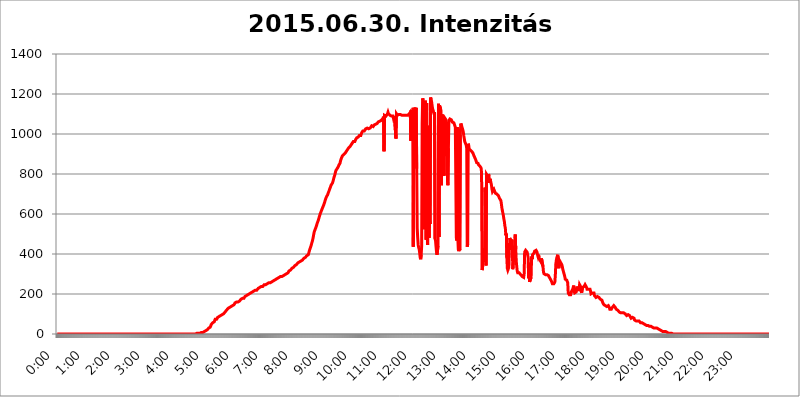
| Category | 2015.06.30. Intenzitás [W/m^2] |
|---|---|
| 0.0 | 0 |
| 0.0006944444444444445 | 0 |
| 0.001388888888888889 | 0 |
| 0.0020833333333333333 | 0 |
| 0.002777777777777778 | 0 |
| 0.003472222222222222 | 0 |
| 0.004166666666666667 | 0 |
| 0.004861111111111111 | 0 |
| 0.005555555555555556 | 0 |
| 0.0062499999999999995 | 0 |
| 0.006944444444444444 | 0 |
| 0.007638888888888889 | 0 |
| 0.008333333333333333 | 0 |
| 0.009027777777777779 | 0 |
| 0.009722222222222222 | 0 |
| 0.010416666666666666 | 0 |
| 0.011111111111111112 | 0 |
| 0.011805555555555555 | 0 |
| 0.012499999999999999 | 0 |
| 0.013194444444444444 | 0 |
| 0.013888888888888888 | 0 |
| 0.014583333333333332 | 0 |
| 0.015277777777777777 | 0 |
| 0.015972222222222224 | 0 |
| 0.016666666666666666 | 0 |
| 0.017361111111111112 | 0 |
| 0.018055555555555557 | 0 |
| 0.01875 | 0 |
| 0.019444444444444445 | 0 |
| 0.02013888888888889 | 0 |
| 0.020833333333333332 | 0 |
| 0.02152777777777778 | 0 |
| 0.022222222222222223 | 0 |
| 0.02291666666666667 | 0 |
| 0.02361111111111111 | 0 |
| 0.024305555555555556 | 0 |
| 0.024999999999999998 | 0 |
| 0.025694444444444447 | 0 |
| 0.02638888888888889 | 0 |
| 0.027083333333333334 | 0 |
| 0.027777777777777776 | 0 |
| 0.02847222222222222 | 0 |
| 0.029166666666666664 | 0 |
| 0.029861111111111113 | 0 |
| 0.030555555555555555 | 0 |
| 0.03125 | 0 |
| 0.03194444444444445 | 0 |
| 0.03263888888888889 | 0 |
| 0.03333333333333333 | 0 |
| 0.034027777777777775 | 0 |
| 0.034722222222222224 | 0 |
| 0.035416666666666666 | 0 |
| 0.036111111111111115 | 0 |
| 0.03680555555555556 | 0 |
| 0.0375 | 0 |
| 0.03819444444444444 | 0 |
| 0.03888888888888889 | 0 |
| 0.03958333333333333 | 0 |
| 0.04027777777777778 | 0 |
| 0.04097222222222222 | 0 |
| 0.041666666666666664 | 0 |
| 0.042361111111111106 | 0 |
| 0.04305555555555556 | 0 |
| 0.043750000000000004 | 0 |
| 0.044444444444444446 | 0 |
| 0.04513888888888889 | 0 |
| 0.04583333333333334 | 0 |
| 0.04652777777777778 | 0 |
| 0.04722222222222222 | 0 |
| 0.04791666666666666 | 0 |
| 0.04861111111111111 | 0 |
| 0.049305555555555554 | 0 |
| 0.049999999999999996 | 0 |
| 0.05069444444444445 | 0 |
| 0.051388888888888894 | 0 |
| 0.052083333333333336 | 0 |
| 0.05277777777777778 | 0 |
| 0.05347222222222222 | 0 |
| 0.05416666666666667 | 0 |
| 0.05486111111111111 | 0 |
| 0.05555555555555555 | 0 |
| 0.05625 | 0 |
| 0.05694444444444444 | 0 |
| 0.057638888888888885 | 0 |
| 0.05833333333333333 | 0 |
| 0.05902777777777778 | 0 |
| 0.059722222222222225 | 0 |
| 0.06041666666666667 | 0 |
| 0.061111111111111116 | 0 |
| 0.06180555555555556 | 0 |
| 0.0625 | 0 |
| 0.06319444444444444 | 0 |
| 0.06388888888888888 | 0 |
| 0.06458333333333334 | 0 |
| 0.06527777777777778 | 0 |
| 0.06597222222222222 | 0 |
| 0.06666666666666667 | 0 |
| 0.06736111111111111 | 0 |
| 0.06805555555555555 | 0 |
| 0.06874999999999999 | 0 |
| 0.06944444444444443 | 0 |
| 0.07013888888888889 | 0 |
| 0.07083333333333333 | 0 |
| 0.07152777777777779 | 0 |
| 0.07222222222222223 | 0 |
| 0.07291666666666667 | 0 |
| 0.07361111111111111 | 0 |
| 0.07430555555555556 | 0 |
| 0.075 | 0 |
| 0.07569444444444444 | 0 |
| 0.0763888888888889 | 0 |
| 0.07708333333333334 | 0 |
| 0.07777777777777778 | 0 |
| 0.07847222222222222 | 0 |
| 0.07916666666666666 | 0 |
| 0.0798611111111111 | 0 |
| 0.08055555555555556 | 0 |
| 0.08125 | 0 |
| 0.08194444444444444 | 0 |
| 0.08263888888888889 | 0 |
| 0.08333333333333333 | 0 |
| 0.08402777777777777 | 0 |
| 0.08472222222222221 | 0 |
| 0.08541666666666665 | 0 |
| 0.08611111111111112 | 0 |
| 0.08680555555555557 | 0 |
| 0.08750000000000001 | 0 |
| 0.08819444444444445 | 0 |
| 0.08888888888888889 | 0 |
| 0.08958333333333333 | 0 |
| 0.09027777777777778 | 0 |
| 0.09097222222222222 | 0 |
| 0.09166666666666667 | 0 |
| 0.09236111111111112 | 0 |
| 0.09305555555555556 | 0 |
| 0.09375 | 0 |
| 0.09444444444444444 | 0 |
| 0.09513888888888888 | 0 |
| 0.09583333333333333 | 0 |
| 0.09652777777777777 | 0 |
| 0.09722222222222222 | 0 |
| 0.09791666666666667 | 0 |
| 0.09861111111111111 | 0 |
| 0.09930555555555555 | 0 |
| 0.09999999999999999 | 0 |
| 0.10069444444444443 | 0 |
| 0.1013888888888889 | 0 |
| 0.10208333333333335 | 0 |
| 0.10277777777777779 | 0 |
| 0.10347222222222223 | 0 |
| 0.10416666666666667 | 0 |
| 0.10486111111111111 | 0 |
| 0.10555555555555556 | 0 |
| 0.10625 | 0 |
| 0.10694444444444444 | 0 |
| 0.1076388888888889 | 0 |
| 0.10833333333333334 | 0 |
| 0.10902777777777778 | 0 |
| 0.10972222222222222 | 0 |
| 0.1111111111111111 | 0 |
| 0.11180555555555556 | 0 |
| 0.11180555555555556 | 0 |
| 0.1125 | 0 |
| 0.11319444444444444 | 0 |
| 0.11388888888888889 | 0 |
| 0.11458333333333333 | 0 |
| 0.11527777777777777 | 0 |
| 0.11597222222222221 | 0 |
| 0.11666666666666665 | 0 |
| 0.1173611111111111 | 0 |
| 0.11805555555555557 | 0 |
| 0.11944444444444445 | 0 |
| 0.12013888888888889 | 0 |
| 0.12083333333333333 | 0 |
| 0.12152777777777778 | 0 |
| 0.12222222222222223 | 0 |
| 0.12291666666666667 | 0 |
| 0.12291666666666667 | 0 |
| 0.12361111111111112 | 0 |
| 0.12430555555555556 | 0 |
| 0.125 | 0 |
| 0.12569444444444444 | 0 |
| 0.12638888888888888 | 0 |
| 0.12708333333333333 | 0 |
| 0.16875 | 0 |
| 0.12847222222222224 | 0 |
| 0.12916666666666668 | 0 |
| 0.12986111111111112 | 0 |
| 0.13055555555555556 | 0 |
| 0.13125 | 0 |
| 0.13194444444444445 | 0 |
| 0.1326388888888889 | 0 |
| 0.13333333333333333 | 0 |
| 0.13402777777777777 | 0 |
| 0.13402777777777777 | 0 |
| 0.13472222222222222 | 0 |
| 0.13541666666666666 | 0 |
| 0.1361111111111111 | 0 |
| 0.13749999999999998 | 0 |
| 0.13819444444444443 | 0 |
| 0.1388888888888889 | 0 |
| 0.13958333333333334 | 0 |
| 0.14027777777777778 | 0 |
| 0.14097222222222222 | 0 |
| 0.14166666666666666 | 0 |
| 0.1423611111111111 | 0 |
| 0.14305555555555557 | 0 |
| 0.14375000000000002 | 0 |
| 0.14444444444444446 | 0 |
| 0.1451388888888889 | 0 |
| 0.1451388888888889 | 0 |
| 0.14652777777777778 | 0 |
| 0.14722222222222223 | 0 |
| 0.14791666666666667 | 0 |
| 0.1486111111111111 | 0 |
| 0.14930555555555555 | 0 |
| 0.15 | 0 |
| 0.15069444444444444 | 0 |
| 0.15138888888888888 | 0 |
| 0.15208333333333332 | 0 |
| 0.15277777777777776 | 0 |
| 0.15347222222222223 | 0 |
| 0.15416666666666667 | 0 |
| 0.15486111111111112 | 0 |
| 0.15555555555555556 | 0 |
| 0.15625 | 0 |
| 0.15694444444444444 | 0 |
| 0.15763888888888888 | 0 |
| 0.15833333333333333 | 0 |
| 0.15902777777777777 | 0 |
| 0.15972222222222224 | 0 |
| 0.16041666666666668 | 0 |
| 0.16111111111111112 | 0 |
| 0.16180555555555556 | 0 |
| 0.1625 | 0 |
| 0.16319444444444445 | 0 |
| 0.1638888888888889 | 0 |
| 0.16458333333333333 | 0 |
| 0.16527777777777777 | 0 |
| 0.16597222222222222 | 0 |
| 0.16666666666666666 | 0 |
| 0.1673611111111111 | 0 |
| 0.16805555555555554 | 0 |
| 0.16874999999999998 | 0 |
| 0.16944444444444443 | 0 |
| 0.17013888888888887 | 0 |
| 0.1708333333333333 | 0 |
| 0.17152777777777775 | 0 |
| 0.17222222222222225 | 0 |
| 0.1729166666666667 | 0 |
| 0.17361111111111113 | 0 |
| 0.17430555555555557 | 0 |
| 0.17500000000000002 | 0 |
| 0.17569444444444446 | 0 |
| 0.1763888888888889 | 0 |
| 0.17708333333333334 | 0 |
| 0.17777777777777778 | 0 |
| 0.17847222222222223 | 0 |
| 0.17916666666666667 | 0 |
| 0.1798611111111111 | 0 |
| 0.18055555555555555 | 0 |
| 0.18125 | 0 |
| 0.18194444444444444 | 0 |
| 0.1826388888888889 | 0 |
| 0.18333333333333335 | 0 |
| 0.1840277777777778 | 0 |
| 0.18472222222222223 | 0 |
| 0.18541666666666667 | 0 |
| 0.18611111111111112 | 0 |
| 0.18680555555555556 | 0 |
| 0.1875 | 0 |
| 0.18819444444444444 | 0 |
| 0.18888888888888888 | 0 |
| 0.18958333333333333 | 0 |
| 0.19027777777777777 | 0 |
| 0.1909722222222222 | 0 |
| 0.19166666666666665 | 0 |
| 0.19236111111111112 | 0 |
| 0.19305555555555554 | 0 |
| 0.19375 | 0 |
| 0.19444444444444445 | 3.525 |
| 0.1951388888888889 | 3.525 |
| 0.19583333333333333 | 3.525 |
| 0.19652777777777777 | 3.525 |
| 0.19722222222222222 | 3.525 |
| 0.19791666666666666 | 3.525 |
| 0.1986111111111111 | 3.525 |
| 0.19930555555555554 | 3.525 |
| 0.19999999999999998 | 3.525 |
| 0.20069444444444443 | 3.525 |
| 0.20138888888888887 | 7.887 |
| 0.2020833333333333 | 7.887 |
| 0.2027777777777778 | 7.887 |
| 0.2034722222222222 | 7.887 |
| 0.2041666666666667 | 7.887 |
| 0.20486111111111113 | 12.257 |
| 0.20555555555555557 | 12.257 |
| 0.20625000000000002 | 12.257 |
| 0.20694444444444446 | 12.257 |
| 0.2076388888888889 | 12.257 |
| 0.20833333333333334 | 16.636 |
| 0.20902777777777778 | 16.636 |
| 0.20972222222222223 | 16.636 |
| 0.21041666666666667 | 21.024 |
| 0.2111111111111111 | 21.024 |
| 0.21180555555555555 | 25.419 |
| 0.2125 | 29.823 |
| 0.21319444444444444 | 34.234 |
| 0.2138888888888889 | 34.234 |
| 0.21458333333333335 | 34.234 |
| 0.2152777777777778 | 38.653 |
| 0.21597222222222223 | 47.511 |
| 0.21666666666666667 | 47.511 |
| 0.21736111111111112 | 51.951 |
| 0.21805555555555556 | 56.398 |
| 0.21875 | 56.398 |
| 0.21944444444444444 | 56.398 |
| 0.22013888888888888 | 60.85 |
| 0.22083333333333333 | 65.31 |
| 0.22152777777777777 | 74.246 |
| 0.2222222222222222 | 74.246 |
| 0.22291666666666665 | 74.246 |
| 0.2236111111111111 | 74.246 |
| 0.22430555555555556 | 78.722 |
| 0.225 | 83.205 |
| 0.22569444444444445 | 83.205 |
| 0.2263888888888889 | 83.205 |
| 0.22708333333333333 | 87.692 |
| 0.22777777777777777 | 92.184 |
| 0.22847222222222222 | 92.184 |
| 0.22916666666666666 | 92.184 |
| 0.2298611111111111 | 92.184 |
| 0.23055555555555554 | 96.682 |
| 0.23124999999999998 | 96.682 |
| 0.23194444444444443 | 96.682 |
| 0.23263888888888887 | 101.184 |
| 0.2333333333333333 | 101.184 |
| 0.2340277777777778 | 105.69 |
| 0.2347222222222222 | 105.69 |
| 0.2354166666666667 | 110.201 |
| 0.23611111111111113 | 110.201 |
| 0.23680555555555557 | 114.716 |
| 0.23750000000000002 | 119.235 |
| 0.23819444444444446 | 119.235 |
| 0.2388888888888889 | 123.758 |
| 0.23958333333333334 | 128.284 |
| 0.24027777777777778 | 128.284 |
| 0.24097222222222223 | 128.284 |
| 0.24166666666666667 | 132.814 |
| 0.2423611111111111 | 132.814 |
| 0.24305555555555555 | 137.347 |
| 0.24375 | 137.347 |
| 0.24444444444444446 | 141.884 |
| 0.24513888888888888 | 141.884 |
| 0.24583333333333335 | 141.884 |
| 0.2465277777777778 | 141.884 |
| 0.24722222222222223 | 141.884 |
| 0.24791666666666667 | 146.423 |
| 0.24861111111111112 | 150.964 |
| 0.24930555555555556 | 155.509 |
| 0.25 | 155.509 |
| 0.25069444444444444 | 155.509 |
| 0.2513888888888889 | 160.056 |
| 0.2520833333333333 | 160.056 |
| 0.25277777777777777 | 160.056 |
| 0.2534722222222222 | 160.056 |
| 0.25416666666666665 | 160.056 |
| 0.2548611111111111 | 164.605 |
| 0.2555555555555556 | 164.605 |
| 0.25625000000000003 | 169.156 |
| 0.2569444444444445 | 169.156 |
| 0.2576388888888889 | 173.709 |
| 0.25833333333333336 | 173.709 |
| 0.2590277777777778 | 173.709 |
| 0.25972222222222224 | 178.264 |
| 0.2604166666666667 | 178.264 |
| 0.2611111111111111 | 178.264 |
| 0.26180555555555557 | 178.264 |
| 0.2625 | 182.82 |
| 0.26319444444444445 | 187.378 |
| 0.2638888888888889 | 191.937 |
| 0.26458333333333334 | 191.937 |
| 0.2652777777777778 | 191.937 |
| 0.2659722222222222 | 196.497 |
| 0.26666666666666666 | 196.497 |
| 0.2673611111111111 | 196.497 |
| 0.26805555555555555 | 196.497 |
| 0.26875 | 201.058 |
| 0.26944444444444443 | 201.058 |
| 0.2701388888888889 | 201.058 |
| 0.2708333333333333 | 205.62 |
| 0.27152777777777776 | 205.62 |
| 0.2722222222222222 | 205.62 |
| 0.27291666666666664 | 205.62 |
| 0.2736111111111111 | 210.182 |
| 0.2743055555555555 | 210.182 |
| 0.27499999999999997 | 214.746 |
| 0.27569444444444446 | 214.746 |
| 0.27638888888888885 | 214.746 |
| 0.27708333333333335 | 219.309 |
| 0.2777777777777778 | 219.309 |
| 0.27847222222222223 | 219.309 |
| 0.2791666666666667 | 219.309 |
| 0.2798611111111111 | 219.309 |
| 0.28055555555555556 | 223.873 |
| 0.28125 | 223.873 |
| 0.28194444444444444 | 228.436 |
| 0.2826388888888889 | 228.436 |
| 0.2833333333333333 | 228.436 |
| 0.28402777777777777 | 233 |
| 0.2847222222222222 | 233 |
| 0.28541666666666665 | 233 |
| 0.28611111111111115 | 237.564 |
| 0.28680555555555554 | 237.564 |
| 0.28750000000000003 | 237.564 |
| 0.2881944444444445 | 237.564 |
| 0.2888888888888889 | 242.127 |
| 0.28958333333333336 | 242.127 |
| 0.2902777777777778 | 246.689 |
| 0.29097222222222224 | 246.689 |
| 0.2916666666666667 | 246.689 |
| 0.2923611111111111 | 246.689 |
| 0.29305555555555557 | 246.689 |
| 0.29375 | 251.251 |
| 0.29444444444444445 | 251.251 |
| 0.2951388888888889 | 251.251 |
| 0.29583333333333334 | 251.251 |
| 0.2965277777777778 | 255.813 |
| 0.2972222222222222 | 255.813 |
| 0.29791666666666666 | 255.813 |
| 0.2986111111111111 | 255.813 |
| 0.29930555555555555 | 260.373 |
| 0.3 | 260.373 |
| 0.30069444444444443 | 260.373 |
| 0.3013888888888889 | 264.932 |
| 0.3020833333333333 | 264.932 |
| 0.30277777777777776 | 264.932 |
| 0.3034722222222222 | 269.49 |
| 0.30416666666666664 | 269.49 |
| 0.3048611111111111 | 269.49 |
| 0.3055555555555555 | 269.49 |
| 0.30624999999999997 | 274.047 |
| 0.3069444444444444 | 274.047 |
| 0.3076388888888889 | 274.047 |
| 0.30833333333333335 | 278.603 |
| 0.3090277777777778 | 278.603 |
| 0.30972222222222223 | 278.603 |
| 0.3104166666666667 | 283.156 |
| 0.3111111111111111 | 283.156 |
| 0.31180555555555556 | 283.156 |
| 0.3125 | 283.156 |
| 0.31319444444444444 | 287.709 |
| 0.3138888888888889 | 287.709 |
| 0.3145833333333333 | 287.709 |
| 0.31527777777777777 | 287.709 |
| 0.3159722222222222 | 287.709 |
| 0.31666666666666665 | 292.259 |
| 0.31736111111111115 | 292.259 |
| 0.31805555555555554 | 292.259 |
| 0.31875000000000003 | 292.259 |
| 0.3194444444444445 | 296.808 |
| 0.3201388888888889 | 296.808 |
| 0.32083333333333336 | 296.808 |
| 0.3215277777777778 | 301.354 |
| 0.32222222222222224 | 305.898 |
| 0.3229166666666667 | 305.898 |
| 0.3236111111111111 | 305.898 |
| 0.32430555555555557 | 310.44 |
| 0.325 | 314.98 |
| 0.32569444444444445 | 314.98 |
| 0.3263888888888889 | 319.517 |
| 0.32708333333333334 | 319.517 |
| 0.3277777777777778 | 324.052 |
| 0.3284722222222222 | 324.052 |
| 0.32916666666666666 | 328.584 |
| 0.3298611111111111 | 328.584 |
| 0.33055555555555555 | 333.113 |
| 0.33125 | 333.113 |
| 0.33194444444444443 | 333.113 |
| 0.3326388888888889 | 337.639 |
| 0.3333333333333333 | 342.162 |
| 0.3340277777777778 | 342.162 |
| 0.3347222222222222 | 342.162 |
| 0.3354166666666667 | 346.682 |
| 0.3361111111111111 | 351.198 |
| 0.3368055555555556 | 351.198 |
| 0.33749999999999997 | 355.712 |
| 0.33819444444444446 | 355.712 |
| 0.33888888888888885 | 355.712 |
| 0.33958333333333335 | 360.221 |
| 0.34027777777777773 | 360.221 |
| 0.34097222222222223 | 364.728 |
| 0.3416666666666666 | 364.728 |
| 0.3423611111111111 | 364.728 |
| 0.3430555555555555 | 369.23 |
| 0.34375 | 369.23 |
| 0.3444444444444445 | 373.729 |
| 0.3451388888888889 | 373.729 |
| 0.3458333333333334 | 378.224 |
| 0.34652777777777777 | 378.224 |
| 0.34722222222222227 | 382.715 |
| 0.34791666666666665 | 382.715 |
| 0.34861111111111115 | 387.202 |
| 0.34930555555555554 | 387.202 |
| 0.35000000000000003 | 391.685 |
| 0.3506944444444444 | 391.685 |
| 0.3513888888888889 | 396.164 |
| 0.3520833333333333 | 396.164 |
| 0.3527777777777778 | 405.108 |
| 0.3534722222222222 | 409.574 |
| 0.3541666666666667 | 422.943 |
| 0.3548611111111111 | 427.39 |
| 0.35555555555555557 | 436.27 |
| 0.35625 | 445.129 |
| 0.35694444444444445 | 453.968 |
| 0.3576388888888889 | 462.786 |
| 0.35833333333333334 | 471.582 |
| 0.3590277777777778 | 484.735 |
| 0.3597222222222222 | 497.836 |
| 0.36041666666666666 | 510.885 |
| 0.3611111111111111 | 515.223 |
| 0.36180555555555555 | 523.88 |
| 0.3625 | 528.2 |
| 0.36319444444444443 | 536.82 |
| 0.3638888888888889 | 545.416 |
| 0.3645833333333333 | 553.986 |
| 0.3652777777777778 | 558.261 |
| 0.3659722222222222 | 566.793 |
| 0.3666666666666667 | 575.299 |
| 0.3673611111111111 | 583.779 |
| 0.3680555555555556 | 592.233 |
| 0.36874999999999997 | 600.661 |
| 0.36944444444444446 | 604.864 |
| 0.37013888888888885 | 613.252 |
| 0.37083333333333335 | 617.436 |
| 0.37152777777777773 | 625.784 |
| 0.37222222222222223 | 629.948 |
| 0.3729166666666666 | 638.256 |
| 0.3736111111111111 | 642.4 |
| 0.3743055555555555 | 650.667 |
| 0.375 | 658.909 |
| 0.3756944444444445 | 667.123 |
| 0.3763888888888889 | 675.311 |
| 0.3770833333333334 | 679.395 |
| 0.37777777777777777 | 687.544 |
| 0.37847222222222227 | 691.608 |
| 0.37916666666666665 | 695.666 |
| 0.37986111111111115 | 703.762 |
| 0.38055555555555554 | 707.8 |
| 0.38125000000000003 | 715.858 |
| 0.3819444444444444 | 723.889 |
| 0.3826388888888889 | 727.896 |
| 0.3833333333333333 | 735.89 |
| 0.3840277777777778 | 743.859 |
| 0.3847222222222222 | 743.859 |
| 0.3854166666666667 | 743.859 |
| 0.3861111111111111 | 755.766 |
| 0.38680555555555557 | 763.674 |
| 0.3875 | 767.62 |
| 0.38819444444444445 | 783.342 |
| 0.3888888888888889 | 787.258 |
| 0.38958333333333334 | 798.974 |
| 0.3902777777777778 | 810.641 |
| 0.3909722222222222 | 818.392 |
| 0.39166666666666666 | 822.26 |
| 0.3923611111111111 | 826.123 |
| 0.39305555555555555 | 829.981 |
| 0.39375 | 833.834 |
| 0.39444444444444443 | 837.682 |
| 0.3951388888888889 | 845.365 |
| 0.3958333333333333 | 849.199 |
| 0.3965277777777778 | 853.029 |
| 0.3972222222222222 | 864.493 |
| 0.3979166666666667 | 872.114 |
| 0.3986111111111111 | 879.719 |
| 0.3993055555555556 | 883.516 |
| 0.39999999999999997 | 891.099 |
| 0.40069444444444446 | 894.885 |
| 0.40138888888888885 | 894.885 |
| 0.40208333333333335 | 898.668 |
| 0.40277777777777773 | 902.447 |
| 0.40347222222222223 | 902.447 |
| 0.4041666666666666 | 906.223 |
| 0.4048611111111111 | 909.996 |
| 0.4055555555555555 | 913.766 |
| 0.40625 | 913.766 |
| 0.4069444444444445 | 921.298 |
| 0.4076388888888889 | 925.06 |
| 0.4083333333333334 | 928.819 |
| 0.40902777777777777 | 928.819 |
| 0.40972222222222227 | 932.576 |
| 0.41041666666666665 | 936.33 |
| 0.41111111111111115 | 936.33 |
| 0.41180555555555554 | 940.082 |
| 0.41250000000000003 | 947.58 |
| 0.4131944444444444 | 947.58 |
| 0.4138888888888889 | 955.071 |
| 0.4145833333333333 | 955.071 |
| 0.4152777777777778 | 962.555 |
| 0.4159722222222222 | 962.555 |
| 0.4166666666666667 | 962.555 |
| 0.4173611111111111 | 962.555 |
| 0.41805555555555557 | 966.295 |
| 0.41875 | 973.772 |
| 0.41944444444444445 | 977.508 |
| 0.4201388888888889 | 981.244 |
| 0.42083333333333334 | 981.244 |
| 0.4215277777777778 | 984.98 |
| 0.4222222222222222 | 984.98 |
| 0.42291666666666666 | 988.714 |
| 0.4236111111111111 | 992.448 |
| 0.42430555555555555 | 992.448 |
| 0.425 | 992.448 |
| 0.42569444444444443 | 992.448 |
| 0.4263888888888889 | 999.916 |
| 0.4270833333333333 | 1007.383 |
| 0.4277777777777778 | 1007.383 |
| 0.4284722222222222 | 1014.852 |
| 0.4291666666666667 | 1014.852 |
| 0.4298611111111111 | 1014.852 |
| 0.4305555555555556 | 1014.852 |
| 0.43124999999999997 | 1014.852 |
| 0.43194444444444446 | 1014.852 |
| 0.43263888888888885 | 1026.06 |
| 0.43333333333333335 | 1022.323 |
| 0.43402777777777773 | 1029.798 |
| 0.43472222222222223 | 1029.798 |
| 0.4354166666666666 | 1029.798 |
| 0.4361111111111111 | 1026.06 |
| 0.4368055555555555 | 1026.06 |
| 0.4375 | 1029.798 |
| 0.4381944444444445 | 1029.798 |
| 0.4388888888888889 | 1029.798 |
| 0.4395833333333334 | 1033.537 |
| 0.44027777777777777 | 1033.537 |
| 0.44097222222222227 | 1041.019 |
| 0.44166666666666665 | 1041.019 |
| 0.44236111111111115 | 1041.019 |
| 0.44305555555555554 | 1037.277 |
| 0.44375000000000003 | 1041.019 |
| 0.4444444444444444 | 1044.762 |
| 0.4451388888888889 | 1041.019 |
| 0.4458333333333333 | 1044.762 |
| 0.4465277777777778 | 1048.508 |
| 0.4472222222222222 | 1044.762 |
| 0.4479166666666667 | 1048.508 |
| 0.4486111111111111 | 1052.255 |
| 0.44930555555555557 | 1056.004 |
| 0.45 | 1059.756 |
| 0.45069444444444445 | 1056.004 |
| 0.4513888888888889 | 1063.51 |
| 0.45208333333333334 | 1063.51 |
| 0.4527777777777778 | 1059.756 |
| 0.4534722222222222 | 1067.267 |
| 0.45416666666666666 | 1067.267 |
| 0.4548611111111111 | 1067.267 |
| 0.45555555555555555 | 1071.027 |
| 0.45625 | 1074.789 |
| 0.45694444444444443 | 1074.789 |
| 0.4576388888888889 | 1086.097 |
| 0.4583333333333333 | 913.766 |
| 0.4590277777777778 | 1093.653 |
| 0.4597222222222222 | 1089.873 |
| 0.4604166666666667 | 1089.873 |
| 0.4611111111111111 | 1089.873 |
| 0.4618055555555556 | 1093.653 |
| 0.46249999999999997 | 1093.653 |
| 0.46319444444444446 | 1101.226 |
| 0.46388888888888885 | 1108.816 |
| 0.46458333333333335 | 1101.226 |
| 0.46527777777777773 | 1101.226 |
| 0.46597222222222223 | 1097.437 |
| 0.4666666666666666 | 1093.653 |
| 0.4673611111111111 | 1093.653 |
| 0.4680555555555555 | 1089.873 |
| 0.46875 | 1089.873 |
| 0.4694444444444445 | 1089.873 |
| 0.4701388888888889 | 1086.097 |
| 0.4708333333333334 | 1089.873 |
| 0.47152777777777777 | 1078.555 |
| 0.47222222222222227 | 1078.555 |
| 0.47291666666666665 | 1089.873 |
| 0.47361111111111115 | 1086.097 |
| 0.47430555555555554 | 1086.097 |
| 0.47500000000000003 | 977.508 |
| 0.4756944444444444 | 1101.226 |
| 0.4763888888888889 | 1097.437 |
| 0.4770833333333333 | 1093.653 |
| 0.4777777777777778 | 1089.873 |
| 0.4784722222222222 | 1093.653 |
| 0.4791666666666667 | 1097.437 |
| 0.4798611111111111 | 1097.437 |
| 0.48055555555555557 | 1097.437 |
| 0.48125 | 1097.437 |
| 0.48194444444444445 | 1097.437 |
| 0.4826388888888889 | 1097.437 |
| 0.48333333333333334 | 1093.653 |
| 0.4840277777777778 | 1097.437 |
| 0.4847222222222222 | 1097.437 |
| 0.48541666666666666 | 1093.653 |
| 0.4861111111111111 | 1097.437 |
| 0.48680555555555555 | 1093.653 |
| 0.4875 | 1093.653 |
| 0.48819444444444443 | 1093.653 |
| 0.4888888888888889 | 1089.873 |
| 0.4895833333333333 | 1093.653 |
| 0.4902777777777778 | 1097.437 |
| 0.4909722222222222 | 1097.437 |
| 0.4916666666666667 | 1093.653 |
| 0.4923611111111111 | 1089.873 |
| 0.4930555555555556 | 1093.653 |
| 0.49374999999999997 | 1101.226 |
| 0.49444444444444446 | 1105.019 |
| 0.49513888888888885 | 1108.816 |
| 0.49583333333333335 | 966.295 |
| 0.49652777777777773 | 1120.238 |
| 0.49722222222222223 | 1108.816 |
| 0.4979166666666666 | 1108.816 |
| 0.4986111111111111 | 1059.756 |
| 0.4993055555555555 | 436.27 |
| 0.5 | 1131.708 |
| 0.5006944444444444 | 1127.879 |
| 0.5013888888888889 | 1101.226 |
| 0.5020833333333333 | 1105.019 |
| 0.5027777777777778 | 1101.226 |
| 0.5034722222222222 | 1131.708 |
| 0.5041666666666667 | 826.123 |
| 0.5048611111111111 | 528.2 |
| 0.5055555555555555 | 480.356 |
| 0.50625 | 445.129 |
| 0.5069444444444444 | 431.833 |
| 0.5076388888888889 | 422.943 |
| 0.5083333333333333 | 405.108 |
| 0.5090277777777777 | 382.715 |
| 0.5097222222222222 | 373.729 |
| 0.5104166666666666 | 396.164 |
| 0.5111111111111112 | 440.702 |
| 0.5118055555555555 | 1052.255 |
| 0.5125000000000001 | 1178.177 |
| 0.5131944444444444 | 1170.358 |
| 0.513888888888889 | 1166.46 |
| 0.5145833333333333 | 906.223 |
| 0.5152777777777778 | 523.88 |
| 0.5159722222222222 | 1166.46 |
| 0.5166666666666667 | 1150.946 |
| 0.517361111111111 | 471.582 |
| 0.5180555555555556 | 1154.814 |
| 0.5187499999999999 | 510.885 |
| 0.5194444444444445 | 445.129 |
| 0.5201388888888888 | 1041.019 |
| 0.5208333333333334 | 860.676 |
| 0.5215277777777778 | 480.356 |
| 0.5222222222222223 | 566.793 |
| 0.5229166666666667 | 549.704 |
| 0.5236111111111111 | 1182.099 |
| 0.5243055555555556 | 1174.263 |
| 0.525 | 1162.571 |
| 0.5256944444444445 | 1143.232 |
| 0.5263888888888889 | 1127.879 |
| 0.5270833333333333 | 1120.238 |
| 0.5277777777777778 | 1108.816 |
| 0.5284722222222222 | 1101.226 |
| 0.5291666666666667 | 1108.816 |
| 0.5298611111111111 | 475.972 |
| 0.5305555555555556 | 467.187 |
| 0.53125 | 436.27 |
| 0.5319444444444444 | 409.574 |
| 0.5326388888888889 | 396.164 |
| 0.5333333333333333 | 396.164 |
| 0.5340277777777778 | 440.702 |
| 0.5347222222222222 | 1150.946 |
| 0.5354166666666667 | 484.735 |
| 0.5361111111111111 | 1143.232 |
| 0.5368055555555555 | 1139.384 |
| 0.5375 | 1127.879 |
| 0.5381944444444444 | 1116.426 |
| 0.5388888888888889 | 743.859 |
| 0.5395833333333333 | 1097.437 |
| 0.5402777777777777 | 1089.873 |
| 0.5409722222222222 | 1086.097 |
| 0.5416666666666666 | 1082.324 |
| 0.5423611111111112 | 791.169 |
| 0.5430555555555555 | 1063.51 |
| 0.5437500000000001 | 1078.555 |
| 0.5444444444444444 | 1074.789 |
| 0.545138888888889 | 1071.027 |
| 0.5458333333333333 | 1059.756 |
| 0.5465277777777778 | 1048.508 |
| 0.5472222222222222 | 771.559 |
| 0.5479166666666667 | 743.859 |
| 0.548611111111111 | 928.819 |
| 0.5493055555555556 | 1067.267 |
| 0.5499999999999999 | 1071.027 |
| 0.5506944444444445 | 1074.789 |
| 0.5513888888888888 | 1074.789 |
| 0.5520833333333334 | 1074.789 |
| 0.5527777777777778 | 1071.027 |
| 0.5534722222222223 | 1067.267 |
| 0.5541666666666667 | 1059.756 |
| 0.5548611111111111 | 1059.756 |
| 0.5555555555555556 | 1056.004 |
| 0.55625 | 1056.004 |
| 0.5569444444444445 | 1052.255 |
| 0.5576388888888889 | 1041.019 |
| 0.5583333333333333 | 1033.537 |
| 0.5590277777777778 | 1033.537 |
| 0.5597222222222222 | 480.356 |
| 0.5604166666666667 | 467.187 |
| 0.5611111111111111 | 1033.537 |
| 0.5618055555555556 | 480.356 |
| 0.5625 | 422.943 |
| 0.5631944444444444 | 414.035 |
| 0.5638888888888889 | 427.39 |
| 0.5645833333333333 | 418.492 |
| 0.5652777777777778 | 996.182 |
| 0.5659722222222222 | 1052.255 |
| 0.5666666666666667 | 1048.508 |
| 0.5673611111111111 | 1037.277 |
| 0.5680555555555555 | 1037.277 |
| 0.56875 | 1022.323 |
| 0.5694444444444444 | 1011.118 |
| 0.5701388888888889 | 992.448 |
| 0.5708333333333333 | 992.448 |
| 0.5715277777777777 | 962.555 |
| 0.5722222222222222 | 958.814 |
| 0.5729166666666666 | 962.555 |
| 0.5736111111111112 | 943.832 |
| 0.5743055555555555 | 928.819 |
| 0.5750000000000001 | 436.27 |
| 0.5756944444444444 | 449.551 |
| 0.576388888888889 | 951.327 |
| 0.5770833333333333 | 943.832 |
| 0.5777777777777778 | 925.06 |
| 0.5784722222222222 | 928.819 |
| 0.5791666666666667 | 925.06 |
| 0.579861111111111 | 917.534 |
| 0.5805555555555556 | 917.534 |
| 0.5812499999999999 | 913.766 |
| 0.5819444444444445 | 909.996 |
| 0.5826388888888888 | 909.996 |
| 0.5833333333333334 | 902.447 |
| 0.5840277777777778 | 894.885 |
| 0.5847222222222223 | 891.099 |
| 0.5854166666666667 | 883.516 |
| 0.5861111111111111 | 883.516 |
| 0.5868055555555556 | 872.114 |
| 0.5875 | 864.493 |
| 0.5881944444444445 | 856.855 |
| 0.5888888888888889 | 856.855 |
| 0.5895833333333333 | 853.029 |
| 0.5902777777777778 | 853.029 |
| 0.5909722222222222 | 845.365 |
| 0.5916666666666667 | 845.365 |
| 0.5923611111111111 | 841.526 |
| 0.5930555555555556 | 837.682 |
| 0.59375 | 833.834 |
| 0.5944444444444444 | 829.981 |
| 0.5951388888888889 | 806.757 |
| 0.5958333333333333 | 319.517 |
| 0.5965277777777778 | 328.584 |
| 0.5972222222222222 | 382.715 |
| 0.5979166666666667 | 427.39 |
| 0.5986111111111111 | 360.221 |
| 0.5993055555555555 | 373.729 |
| 0.6 | 731.896 |
| 0.6006944444444444 | 596.45 |
| 0.6013888888888889 | 342.162 |
| 0.6020833333333333 | 798.974 |
| 0.6027777777777777 | 795.074 |
| 0.6034722222222222 | 791.169 |
| 0.6041666666666666 | 783.342 |
| 0.6048611111111112 | 798.974 |
| 0.6055555555555555 | 791.169 |
| 0.6062500000000001 | 755.766 |
| 0.6069444444444444 | 775.492 |
| 0.607638888888889 | 767.62 |
| 0.6083333333333333 | 755.766 |
| 0.6090277777777778 | 743.859 |
| 0.6097222222222222 | 723.889 |
| 0.6104166666666667 | 711.832 |
| 0.611111111111111 | 707.8 |
| 0.6118055555555556 | 719.877 |
| 0.6124999999999999 | 707.8 |
| 0.6131944444444445 | 715.858 |
| 0.6138888888888888 | 711.832 |
| 0.6145833333333334 | 703.762 |
| 0.6152777777777778 | 703.762 |
| 0.6159722222222223 | 699.717 |
| 0.6166666666666667 | 699.717 |
| 0.6173611111111111 | 695.666 |
| 0.6180555555555556 | 695.666 |
| 0.61875 | 691.608 |
| 0.6194444444444445 | 687.544 |
| 0.6201388888888889 | 679.395 |
| 0.6208333333333333 | 675.311 |
| 0.6215277777777778 | 675.311 |
| 0.6222222222222222 | 667.123 |
| 0.6229166666666667 | 650.667 |
| 0.6236111111111111 | 629.948 |
| 0.6243055555555556 | 617.436 |
| 0.625 | 604.864 |
| 0.6256944444444444 | 592.233 |
| 0.6263888888888889 | 575.299 |
| 0.6270833333333333 | 562.53 |
| 0.6277777777777778 | 541.121 |
| 0.6284722222222222 | 528.2 |
| 0.6291666666666667 | 493.475 |
| 0.6298611111111111 | 502.192 |
| 0.6305555555555555 | 382.715 |
| 0.63125 | 328.584 |
| 0.6319444444444444 | 319.517 |
| 0.6326388888888889 | 324.052 |
| 0.6333333333333333 | 333.113 |
| 0.6340277777777777 | 409.574 |
| 0.6347222222222222 | 480.356 |
| 0.6354166666666666 | 484.735 |
| 0.6361111111111112 | 484.735 |
| 0.6368055555555555 | 458.38 |
| 0.6375000000000001 | 471.582 |
| 0.6381944444444444 | 462.786 |
| 0.638888888888889 | 324.052 |
| 0.6395833333333333 | 355.712 |
| 0.6402777777777778 | 364.728 |
| 0.6409722222222222 | 360.221 |
| 0.6416666666666667 | 369.23 |
| 0.642361111111111 | 497.836 |
| 0.6430555555555556 | 422.943 |
| 0.6437499999999999 | 364.728 |
| 0.6444444444444445 | 337.639 |
| 0.6451388888888888 | 314.98 |
| 0.6458333333333334 | 305.898 |
| 0.6465277777777778 | 305.898 |
| 0.6472222222222223 | 305.898 |
| 0.6479166666666667 | 305.898 |
| 0.6486111111111111 | 305.898 |
| 0.6493055555555556 | 301.354 |
| 0.65 | 296.808 |
| 0.6506944444444445 | 296.808 |
| 0.6513888888888889 | 292.259 |
| 0.6520833333333333 | 287.709 |
| 0.6527777777777778 | 283.156 |
| 0.6534722222222222 | 283.156 |
| 0.6541666666666667 | 283.156 |
| 0.6548611111111111 | 301.354 |
| 0.6555555555555556 | 409.574 |
| 0.65625 | 414.035 |
| 0.6569444444444444 | 418.492 |
| 0.6576388888888889 | 418.492 |
| 0.6583333333333333 | 418.492 |
| 0.6590277777777778 | 409.574 |
| 0.6597222222222222 | 414.035 |
| 0.6604166666666667 | 382.715 |
| 0.6611111111111111 | 278.603 |
| 0.6618055555555555 | 355.712 |
| 0.6625 | 260.373 |
| 0.6631944444444444 | 260.373 |
| 0.6638888888888889 | 260.373 |
| 0.6645833333333333 | 283.156 |
| 0.6652777777777777 | 387.202 |
| 0.6659722222222222 | 373.729 |
| 0.6666666666666666 | 396.164 |
| 0.6673611111111111 | 391.685 |
| 0.6680555555555556 | 400.638 |
| 0.6687500000000001 | 405.108 |
| 0.6694444444444444 | 414.035 |
| 0.6701388888888888 | 418.492 |
| 0.6708333333333334 | 418.492 |
| 0.6715277777777778 | 418.492 |
| 0.6722222222222222 | 414.035 |
| 0.6729166666666666 | 409.574 |
| 0.6736111111111112 | 396.164 |
| 0.6743055555555556 | 387.202 |
| 0.6749999999999999 | 396.164 |
| 0.6756944444444444 | 382.715 |
| 0.6763888888888889 | 373.729 |
| 0.6770833333333334 | 373.729 |
| 0.6777777777777777 | 378.224 |
| 0.6784722222222223 | 360.221 |
| 0.6791666666666667 | 378.224 |
| 0.6798611111111111 | 378.224 |
| 0.6805555555555555 | 382.715 |
| 0.68125 | 337.639 |
| 0.6819444444444445 | 310.44 |
| 0.6826388888888889 | 301.354 |
| 0.6833333333333332 | 301.354 |
| 0.6840277777777778 | 296.808 |
| 0.6847222222222222 | 296.808 |
| 0.6854166666666667 | 296.808 |
| 0.686111111111111 | 296.808 |
| 0.6868055555555556 | 296.808 |
| 0.6875 | 292.259 |
| 0.6881944444444444 | 292.259 |
| 0.688888888888889 | 292.259 |
| 0.6895833333333333 | 292.259 |
| 0.6902777777777778 | 283.156 |
| 0.6909722222222222 | 278.603 |
| 0.6916666666666668 | 274.047 |
| 0.6923611111111111 | 269.49 |
| 0.6930555555555555 | 264.932 |
| 0.69375 | 260.373 |
| 0.6944444444444445 | 251.251 |
| 0.6951388888888889 | 246.689 |
| 0.6958333333333333 | 246.689 |
| 0.6965277777777777 | 251.251 |
| 0.6972222222222223 | 255.813 |
| 0.6979166666666666 | 260.373 |
| 0.6986111111111111 | 296.808 |
| 0.6993055555555556 | 351.198 |
| 0.7000000000000001 | 369.23 |
| 0.7006944444444444 | 382.715 |
| 0.7013888888888888 | 387.202 |
| 0.7020833333333334 | 396.164 |
| 0.7027777777777778 | 337.639 |
| 0.7034722222222222 | 328.584 |
| 0.7041666666666666 | 351.198 |
| 0.7048611111111112 | 364.728 |
| 0.7055555555555556 | 364.728 |
| 0.7062499999999999 | 355.712 |
| 0.7069444444444444 | 351.198 |
| 0.7076388888888889 | 346.682 |
| 0.7083333333333334 | 337.639 |
| 0.7090277777777777 | 324.052 |
| 0.7097222222222223 | 314.98 |
| 0.7104166666666667 | 305.898 |
| 0.7111111111111111 | 296.808 |
| 0.7118055555555555 | 287.709 |
| 0.7125 | 274.047 |
| 0.7131944444444445 | 269.49 |
| 0.7138888888888889 | 269.49 |
| 0.7145833333333332 | 269.49 |
| 0.7152777777777778 | 269.49 |
| 0.7159722222222222 | 255.813 |
| 0.7166666666666667 | 205.62 |
| 0.717361111111111 | 201.058 |
| 0.7180555555555556 | 196.497 |
| 0.71875 | 196.497 |
| 0.7194444444444444 | 191.937 |
| 0.720138888888889 | 196.497 |
| 0.7208333333333333 | 205.62 |
| 0.7215277777777778 | 214.746 |
| 0.7222222222222222 | 219.309 |
| 0.7229166666666668 | 223.873 |
| 0.7236111111111111 | 228.436 |
| 0.7243055555555555 | 242.127 |
| 0.725 | 214.746 |
| 0.7256944444444445 | 205.62 |
| 0.7263888888888889 | 201.058 |
| 0.7270833333333333 | 201.058 |
| 0.7277777777777777 | 210.182 |
| 0.7284722222222223 | 219.309 |
| 0.7291666666666666 | 237.564 |
| 0.7298611111111111 | 233 |
| 0.7305555555555556 | 214.746 |
| 0.7312500000000001 | 228.436 |
| 0.7319444444444444 | 219.309 |
| 0.7326388888888888 | 246.689 |
| 0.7333333333333334 | 242.127 |
| 0.7340277777777778 | 237.564 |
| 0.7347222222222222 | 214.746 |
| 0.7354166666666666 | 205.62 |
| 0.7361111111111112 | 205.62 |
| 0.7368055555555556 | 233 |
| 0.7374999999999999 | 237.564 |
| 0.7381944444444444 | 233 |
| 0.7388888888888889 | 237.564 |
| 0.7395833333333334 | 242.127 |
| 0.7402777777777777 | 246.689 |
| 0.7409722222222223 | 246.689 |
| 0.7416666666666667 | 242.127 |
| 0.7423611111111111 | 233 |
| 0.7430555555555555 | 223.873 |
| 0.74375 | 223.873 |
| 0.7444444444444445 | 223.873 |
| 0.7451388888888889 | 223.873 |
| 0.7458333333333332 | 228.436 |
| 0.7465277777777778 | 228.436 |
| 0.7472222222222222 | 223.873 |
| 0.7479166666666667 | 214.746 |
| 0.748611111111111 | 201.058 |
| 0.7493055555555556 | 201.058 |
| 0.75 | 196.497 |
| 0.7506944444444444 | 205.62 |
| 0.751388888888889 | 210.182 |
| 0.7520833333333333 | 210.182 |
| 0.7527777777777778 | 205.62 |
| 0.7534722222222222 | 191.937 |
| 0.7541666666666668 | 191.937 |
| 0.7548611111111111 | 187.378 |
| 0.7555555555555555 | 182.82 |
| 0.75625 | 182.82 |
| 0.7569444444444445 | 187.378 |
| 0.7576388888888889 | 187.378 |
| 0.7583333333333333 | 187.378 |
| 0.7590277777777777 | 187.378 |
| 0.7597222222222223 | 182.82 |
| 0.7604166666666666 | 178.264 |
| 0.7611111111111111 | 178.264 |
| 0.7618055555555556 | 173.709 |
| 0.7625000000000001 | 173.709 |
| 0.7631944444444444 | 173.709 |
| 0.7638888888888888 | 169.156 |
| 0.7645833333333334 | 164.605 |
| 0.7652777777777778 | 155.509 |
| 0.7659722222222222 | 155.509 |
| 0.7666666666666666 | 146.423 |
| 0.7673611111111112 | 146.423 |
| 0.7680555555555556 | 146.423 |
| 0.7687499999999999 | 141.884 |
| 0.7694444444444444 | 141.884 |
| 0.7701388888888889 | 137.347 |
| 0.7708333333333334 | 137.347 |
| 0.7715277777777777 | 141.884 |
| 0.7722222222222223 | 137.347 |
| 0.7729166666666667 | 141.884 |
| 0.7736111111111111 | 137.347 |
| 0.7743055555555555 | 132.814 |
| 0.775 | 123.758 |
| 0.7756944444444445 | 128.284 |
| 0.7763888888888889 | 119.235 |
| 0.7770833333333332 | 123.758 |
| 0.7777777777777778 | 128.284 |
| 0.7784722222222222 | 132.814 |
| 0.7791666666666667 | 132.814 |
| 0.779861111111111 | 137.347 |
| 0.7805555555555556 | 141.884 |
| 0.78125 | 141.884 |
| 0.7819444444444444 | 137.347 |
| 0.782638888888889 | 132.814 |
| 0.7833333333333333 | 128.284 |
| 0.7840277777777778 | 123.758 |
| 0.7847222222222222 | 119.235 |
| 0.7854166666666668 | 119.235 |
| 0.7861111111111111 | 119.235 |
| 0.7868055555555555 | 119.235 |
| 0.7875 | 114.716 |
| 0.7881944444444445 | 110.201 |
| 0.7888888888888889 | 110.201 |
| 0.7895833333333333 | 110.201 |
| 0.7902777777777777 | 105.69 |
| 0.7909722222222223 | 101.184 |
| 0.7916666666666666 | 101.184 |
| 0.7923611111111111 | 105.69 |
| 0.7930555555555556 | 105.69 |
| 0.7937500000000001 | 105.69 |
| 0.7944444444444444 | 105.69 |
| 0.7951388888888888 | 105.69 |
| 0.7958333333333334 | 101.184 |
| 0.7965277777777778 | 101.184 |
| 0.7972222222222222 | 96.682 |
| 0.7979166666666666 | 96.682 |
| 0.7986111111111112 | 92.184 |
| 0.7993055555555556 | 96.682 |
| 0.7999999999999999 | 96.682 |
| 0.8006944444444444 | 96.682 |
| 0.8013888888888889 | 96.682 |
| 0.8020833333333334 | 96.682 |
| 0.8027777777777777 | 92.184 |
| 0.8034722222222223 | 92.184 |
| 0.8041666666666667 | 92.184 |
| 0.8048611111111111 | 78.722 |
| 0.8055555555555555 | 83.205 |
| 0.80625 | 83.205 |
| 0.8069444444444445 | 83.205 |
| 0.8076388888888889 | 78.722 |
| 0.8083333333333332 | 78.722 |
| 0.8090277777777778 | 78.722 |
| 0.8097222222222222 | 69.775 |
| 0.8104166666666667 | 74.246 |
| 0.811111111111111 | 69.775 |
| 0.8118055555555556 | 65.31 |
| 0.8125 | 65.31 |
| 0.8131944444444444 | 65.31 |
| 0.813888888888889 | 65.31 |
| 0.8145833333333333 | 65.31 |
| 0.8152777777777778 | 65.31 |
| 0.8159722222222222 | 65.31 |
| 0.8166666666666668 | 60.85 |
| 0.8173611111111111 | 60.85 |
| 0.8180555555555555 | 56.398 |
| 0.81875 | 56.398 |
| 0.8194444444444445 | 60.85 |
| 0.8201388888888889 | 56.398 |
| 0.8208333333333333 | 56.398 |
| 0.8215277777777777 | 51.951 |
| 0.8222222222222223 | 51.951 |
| 0.8229166666666666 | 47.511 |
| 0.8236111111111111 | 47.511 |
| 0.8243055555555556 | 47.511 |
| 0.8250000000000001 | 47.511 |
| 0.8256944444444444 | 43.079 |
| 0.8263888888888888 | 43.079 |
| 0.8270833333333334 | 43.079 |
| 0.8277777777777778 | 43.079 |
| 0.8284722222222222 | 43.079 |
| 0.8291666666666666 | 38.653 |
| 0.8298611111111112 | 38.653 |
| 0.8305555555555556 | 38.653 |
| 0.8312499999999999 | 38.653 |
| 0.8319444444444444 | 38.653 |
| 0.8326388888888889 | 38.653 |
| 0.8333333333333334 | 38.653 |
| 0.8340277777777777 | 34.234 |
| 0.8347222222222223 | 34.234 |
| 0.8354166666666667 | 34.234 |
| 0.8361111111111111 | 34.234 |
| 0.8368055555555555 | 29.823 |
| 0.8375 | 29.823 |
| 0.8381944444444445 | 29.823 |
| 0.8388888888888889 | 29.823 |
| 0.8395833333333332 | 29.823 |
| 0.8402777777777778 | 29.823 |
| 0.8409722222222222 | 29.823 |
| 0.8416666666666667 | 29.823 |
| 0.842361111111111 | 29.823 |
| 0.8430555555555556 | 25.419 |
| 0.84375 | 25.419 |
| 0.8444444444444444 | 21.024 |
| 0.845138888888889 | 21.024 |
| 0.8458333333333333 | 21.024 |
| 0.8465277777777778 | 21.024 |
| 0.8472222222222222 | 16.636 |
| 0.8479166666666668 | 16.636 |
| 0.8486111111111111 | 16.636 |
| 0.8493055555555555 | 12.257 |
| 0.85 | 12.257 |
| 0.8506944444444445 | 12.257 |
| 0.8513888888888889 | 12.257 |
| 0.8520833333333333 | 12.257 |
| 0.8527777777777777 | 12.257 |
| 0.8534722222222223 | 12.257 |
| 0.8541666666666666 | 7.887 |
| 0.8548611111111111 | 7.887 |
| 0.8555555555555556 | 7.887 |
| 0.8562500000000001 | 7.887 |
| 0.8569444444444444 | 3.525 |
| 0.8576388888888888 | 3.525 |
| 0.8583333333333334 | 3.525 |
| 0.8590277777777778 | 3.525 |
| 0.8597222222222222 | 3.525 |
| 0.8604166666666666 | 3.525 |
| 0.8611111111111112 | 3.525 |
| 0.8618055555555556 | 3.525 |
| 0.8624999999999999 | 3.525 |
| 0.8631944444444444 | 3.525 |
| 0.8638888888888889 | 0 |
| 0.8645833333333334 | 0 |
| 0.8652777777777777 | 0 |
| 0.8659722222222223 | 0 |
| 0.8666666666666667 | 0 |
| 0.8673611111111111 | 0 |
| 0.8680555555555555 | 0 |
| 0.86875 | 0 |
| 0.8694444444444445 | 0 |
| 0.8701388888888889 | 0 |
| 0.8708333333333332 | 0 |
| 0.8715277777777778 | 0 |
| 0.8722222222222222 | 0 |
| 0.8729166666666667 | 0 |
| 0.873611111111111 | 0 |
| 0.8743055555555556 | 0 |
| 0.875 | 0 |
| 0.8756944444444444 | 0 |
| 0.876388888888889 | 0 |
| 0.8770833333333333 | 0 |
| 0.8777777777777778 | 0 |
| 0.8784722222222222 | 0 |
| 0.8791666666666668 | 0 |
| 0.8798611111111111 | 0 |
| 0.8805555555555555 | 0 |
| 0.88125 | 0 |
| 0.8819444444444445 | 0 |
| 0.8826388888888889 | 0 |
| 0.8833333333333333 | 0 |
| 0.8840277777777777 | 0 |
| 0.8847222222222223 | 0 |
| 0.8854166666666666 | 0 |
| 0.8861111111111111 | 0 |
| 0.8868055555555556 | 0 |
| 0.8875000000000001 | 0 |
| 0.8881944444444444 | 0 |
| 0.8888888888888888 | 0 |
| 0.8895833333333334 | 0 |
| 0.8902777777777778 | 0 |
| 0.8909722222222222 | 0 |
| 0.8916666666666666 | 0 |
| 0.8923611111111112 | 0 |
| 0.8930555555555556 | 0 |
| 0.8937499999999999 | 0 |
| 0.8944444444444444 | 0 |
| 0.8951388888888889 | 0 |
| 0.8958333333333334 | 0 |
| 0.8965277777777777 | 0 |
| 0.8972222222222223 | 0 |
| 0.8979166666666667 | 0 |
| 0.8986111111111111 | 0 |
| 0.8993055555555555 | 0 |
| 0.9 | 0 |
| 0.9006944444444445 | 0 |
| 0.9013888888888889 | 0 |
| 0.9020833333333332 | 0 |
| 0.9027777777777778 | 0 |
| 0.9034722222222222 | 0 |
| 0.9041666666666667 | 0 |
| 0.904861111111111 | 0 |
| 0.9055555555555556 | 0 |
| 0.90625 | 0 |
| 0.9069444444444444 | 0 |
| 0.907638888888889 | 0 |
| 0.9083333333333333 | 0 |
| 0.9090277777777778 | 0 |
| 0.9097222222222222 | 0 |
| 0.9104166666666668 | 0 |
| 0.9111111111111111 | 0 |
| 0.9118055555555555 | 0 |
| 0.9125 | 0 |
| 0.9131944444444445 | 0 |
| 0.9138888888888889 | 0 |
| 0.9145833333333333 | 0 |
| 0.9152777777777777 | 0 |
| 0.9159722222222223 | 0 |
| 0.9166666666666666 | 0 |
| 0.9173611111111111 | 0 |
| 0.9180555555555556 | 0 |
| 0.9187500000000001 | 0 |
| 0.9194444444444444 | 0 |
| 0.9201388888888888 | 0 |
| 0.9208333333333334 | 0 |
| 0.9215277777777778 | 0 |
| 0.9222222222222222 | 0 |
| 0.9229166666666666 | 0 |
| 0.9236111111111112 | 0 |
| 0.9243055555555556 | 0 |
| 0.9249999999999999 | 0 |
| 0.9256944444444444 | 0 |
| 0.9263888888888889 | 0 |
| 0.9270833333333334 | 0 |
| 0.9277777777777777 | 0 |
| 0.9284722222222223 | 0 |
| 0.9291666666666667 | 0 |
| 0.9298611111111111 | 0 |
| 0.9305555555555555 | 0 |
| 0.93125 | 0 |
| 0.9319444444444445 | 0 |
| 0.9326388888888889 | 0 |
| 0.9333333333333332 | 0 |
| 0.9340277777777778 | 0 |
| 0.9347222222222222 | 0 |
| 0.9354166666666667 | 0 |
| 0.936111111111111 | 0 |
| 0.9368055555555556 | 0 |
| 0.9375 | 0 |
| 0.9381944444444444 | 0 |
| 0.938888888888889 | 0 |
| 0.9395833333333333 | 0 |
| 0.9402777777777778 | 0 |
| 0.9409722222222222 | 0 |
| 0.9416666666666668 | 0 |
| 0.9423611111111111 | 0 |
| 0.9430555555555555 | 0 |
| 0.94375 | 0 |
| 0.9444444444444445 | 0 |
| 0.9451388888888889 | 0 |
| 0.9458333333333333 | 0 |
| 0.9465277777777777 | 0 |
| 0.9472222222222223 | 0 |
| 0.9479166666666666 | 0 |
| 0.9486111111111111 | 0 |
| 0.9493055555555556 | 0 |
| 0.9500000000000001 | 0 |
| 0.9506944444444444 | 0 |
| 0.9513888888888888 | 0 |
| 0.9520833333333334 | 0 |
| 0.9527777777777778 | 0 |
| 0.9534722222222222 | 0 |
| 0.9541666666666666 | 0 |
| 0.9548611111111112 | 0 |
| 0.9555555555555556 | 0 |
| 0.9562499999999999 | 0 |
| 0.9569444444444444 | 0 |
| 0.9576388888888889 | 0 |
| 0.9583333333333334 | 0 |
| 0.9590277777777777 | 0 |
| 0.9597222222222223 | 0 |
| 0.9604166666666667 | 0 |
| 0.9611111111111111 | 0 |
| 0.9618055555555555 | 0 |
| 0.9625 | 0 |
| 0.9631944444444445 | 0 |
| 0.9638888888888889 | 0 |
| 0.9645833333333332 | 0 |
| 0.9652777777777778 | 0 |
| 0.9659722222222222 | 0 |
| 0.9666666666666667 | 0 |
| 0.967361111111111 | 0 |
| 0.9680555555555556 | 0 |
| 0.96875 | 0 |
| 0.9694444444444444 | 0 |
| 0.970138888888889 | 0 |
| 0.9708333333333333 | 0 |
| 0.9715277777777778 | 0 |
| 0.9722222222222222 | 0 |
| 0.9729166666666668 | 0 |
| 0.9736111111111111 | 0 |
| 0.9743055555555555 | 0 |
| 0.975 | 0 |
| 0.9756944444444445 | 0 |
| 0.9763888888888889 | 0 |
| 0.9770833333333333 | 0 |
| 0.9777777777777777 | 0 |
| 0.9784722222222223 | 0 |
| 0.9791666666666666 | 0 |
| 0.9798611111111111 | 0 |
| 0.9805555555555556 | 0 |
| 0.9812500000000001 | 0 |
| 0.9819444444444444 | 0 |
| 0.9826388888888888 | 0 |
| 0.9833333333333334 | 0 |
| 0.9840277777777778 | 0 |
| 0.9847222222222222 | 0 |
| 0.9854166666666666 | 0 |
| 0.9861111111111112 | 0 |
| 0.9868055555555556 | 0 |
| 0.9874999999999999 | 0 |
| 0.9881944444444444 | 0 |
| 0.9888888888888889 | 0 |
| 0.9895833333333334 | 0 |
| 0.9902777777777777 | 0 |
| 0.9909722222222223 | 0 |
| 0.9916666666666667 | 0 |
| 0.9923611111111111 | 0 |
| 0.9930555555555555 | 0 |
| 0.99375 | 0 |
| 0.9944444444444445 | 0 |
| 0.9951388888888889 | 0 |
| 0.9958333333333332 | 0 |
| 0.9965277777777778 | 0 |
| 0.9972222222222222 | 0 |
| 0.9979166666666667 | 0 |
| 0.998611111111111 | 0 |
| 0.9993055555555556 | 0 |